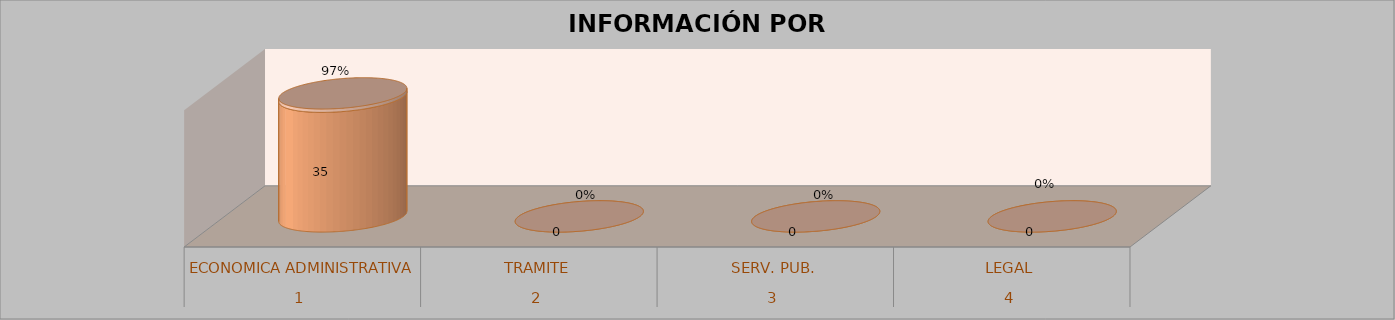
| Category | Series 0 | Series 1 | Series 2 | Series 3 |
|---|---|---|---|---|
| 0 |  |  | 35 | 0.972 |
| 1 |  |  | 0 | 0 |
| 2 |  |  | 0 | 0 |
| 3 |  |  | 0 | 0 |